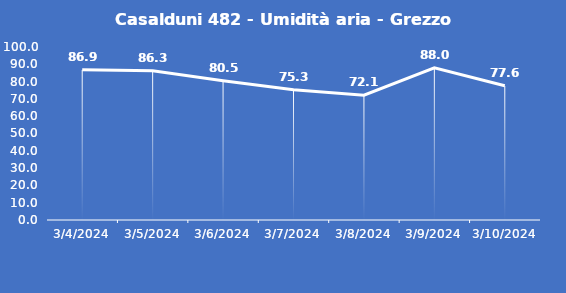
| Category | Casalduni 482 - Umidità aria - Grezzo (%) |
|---|---|
| 3/4/24 | 86.9 |
| 3/5/24 | 86.3 |
| 3/6/24 | 80.5 |
| 3/7/24 | 75.3 |
| 3/8/24 | 72.1 |
| 3/9/24 | 88 |
| 3/10/24 | 77.6 |